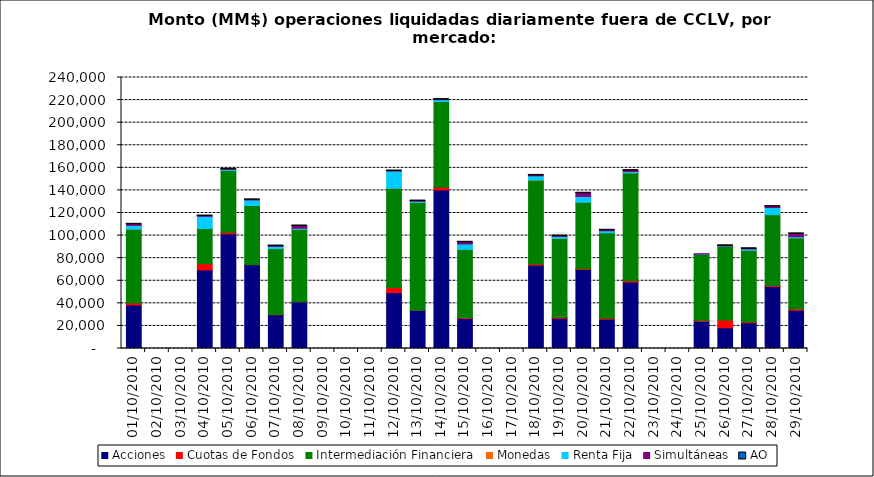
| Category | Acciones | Cuotas de Fondos | Intermediación Financiera | Monedas | Renta Fija | Simultáneas | AO |
|---|---|---|---|---|---|---|---|
| 01/10/2010 | 38549.889 | 1637.426 | 65553.158 | 4.74 | 3297.149 | 925.121 | 0.328 |
| 04/10/2010 | 69569.376 | 5528.453 | 31150.628 | 13.134 | 10789.204 | 256.352 | 0.149 |
| 05/10/2010 | 101455.169 | 1464.712 | 54759.069 | 1.194 | 989.782 | 77.889 | 0.311 |
| 06/10/2010 | 74186.519 | 147.028 | 52286.255 | 13.96 | 4932.016 | 54.557 | 0.179 |
| 07/10/2010 | 29792.878 | 411.091 | 58284.268 | 18.275 | 1932.285 | 282.717 | 0.356 |
| 08/10/2010 | 41360.711 | 129.383 | 64115.913 | 6.944 | 917.27 | 1950.551 | 0.454 |
| 12/10/2010 | 49499.728 | 4553.186 | 87868.429 | 9.204 | 15238.428 | 6.804 | 0.229 |
| 13/10/2010 | 33649.748 | 183.685 | 95571.832 | 24.995 | 1007.1 | 130.239 | 0.462 |
| 14/10/2010 | 140402.966 | 2477.732 | 75880.911 | 0 | 1608.892 | 67.426 | 1.502 |
| 15/10/2010 | 26547.899 | 667.61 | 60533.436 | 2.926 | 4852.328 | 1436.412 | 1.938 |
| 18/10/2010 | 73764.203 | 1162.27 | 74295.115 | 18.854 | 3677.634 | 374.392 | 0.391 |
| 19/10/2010 | 26829.042 | 765.804 | 69945.996 | 15.12 | 1723.029 | 227.469 | 3.281 |
| 20/10/2010 | 69906.353 | 705.96 | 58960.176 | 0.84 | 5007.19 | 2884.634 | 2.995 |
| 21/10/2010 | 25904.708 | 983.55 | 75625.019 | 6.275 | 1769.778 | 409.26 | 1.03 |
| 22/10/2010 | 58718.513 | 1206.151 | 95637.568 | 5.815 | 1149.935 | 802.73 | 0.249 |
| 25/10/2010 | 24073.213 | 625.433 | 58577.72 | 8.294 | 281.209 | 383.991 | 0 |
| 26/10/2010 | 18316.875 | 6844.841 | 65244.307 | 7.142 | 360.493 | 144.507 | 0.828 |
| 27/10/2010 | 22740.329 | 631.197 | 63604.105 | 4.908 | 1184.107 | 141.708 | 1.655 |
| 28/10/2010 | 54898.629 | 845.137 | 62808.454 | 15.758 | 6259.185 | 791.779 | 1.006 |
| 29/10/2010 | 33778.311 | 1302.354 | 62934.465 | 1.25 | 1014.592 | 2476.024 | 0.023 |